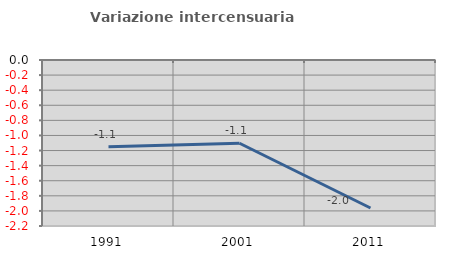
| Category | Variazione intercensuaria annua |
|---|---|
| 1991.0 | -1.149 |
| 2001.0 | -1.104 |
| 2011.0 | -1.961 |